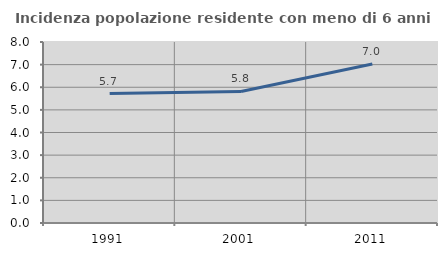
| Category | Incidenza popolazione residente con meno di 6 anni |
|---|---|
| 1991.0 | 5.722 |
| 2001.0 | 5.812 |
| 2011.0 | 7.027 |